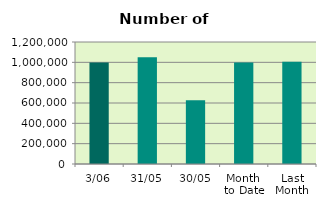
| Category | Series 0 |
|---|---|
| 3/06 | 998422 |
| 31/05 | 1049160 |
| 30/05 | 625880 |
| Month 
to Date | 998422 |
| Last
Month | 1004730.273 |